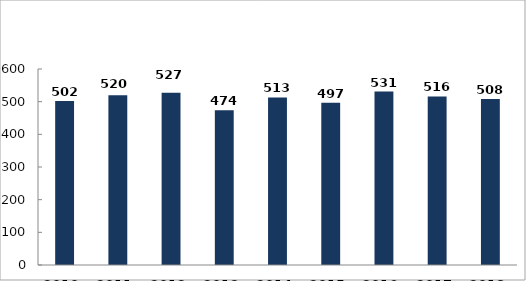
| Category | Személysérüléses közúti közlekedési balesetek száma |
|---|---|
| 2010. év | 502 |
| 2011. év | 520 |
| 2012. év | 527 |
| 2013. év | 474 |
| 2014. év | 513 |
| 2015. év | 497 |
| 2016. év | 531 |
| 2017. év | 516 |
| 2018. év | 508 |